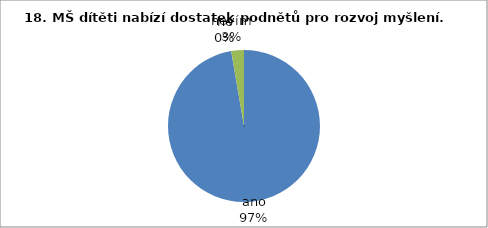
| Category | 18. MŠ dítěti nabízí dostatek podnětů pro rozvoj myšlení. |
|---|---|
| ano | 36 |
| ne | 0 |
| nevím | 1 |